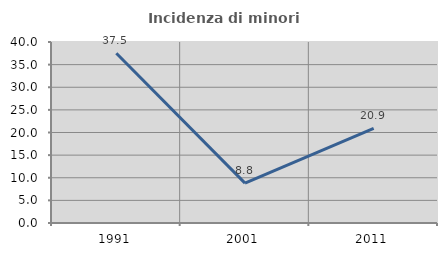
| Category | Incidenza di minori stranieri |
|---|---|
| 1991.0 | 37.5 |
| 2001.0 | 8.824 |
| 2011.0 | 20.93 |